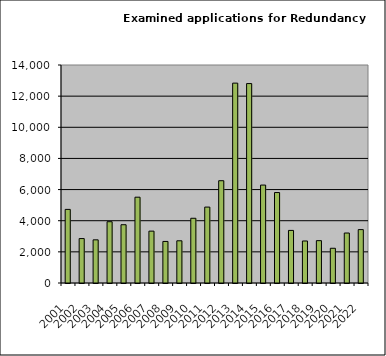
| Category | Series 1 |
|---|---|
| 2001.0 | 4727 |
| 2002.0 | 2853 |
| 2003.0 | 2772 |
| 2004.0 | 3936 |
| 2005.0 | 3742 |
| 2006.0 | 5510 |
| 2007.0 | 3331 |
| 2008.0 | 2669 |
| 2009.0 | 2711 |
| 2010.0 | 4157 |
| 2011.0 | 4875 |
| 2012.0 | 6569 |
| 2013.0 | 12836 |
| 2014.0 | 12807 |
| 2015.0 | 6289 |
| 2016.0 | 5809 |
| 2017.0 | 3377 |
| 2018.0 | 2698 |
| 2019.0 | 2720 |
| 2020.0 | 2230 |
| 2021.0 | 3210 |
| 2022.0 | 3429 |